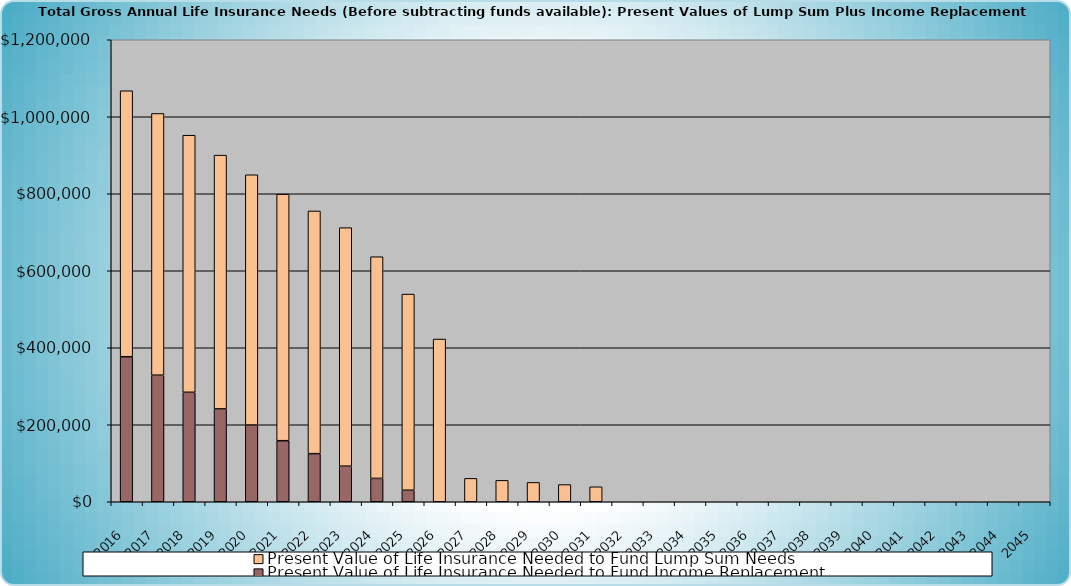
| Category | Present Value of Life Insurance Needed to Fund Income Replacement | Present Value of Life Insurance Needed to Fund Lump Sum Needs |
|---|---|---|
| 2016.0 | 376738.288 | 690818.72 |
| 2017.0 | 328738.288 | 679813.857 |
| 2018.0 | 284330.125 | 667717.162 |
| 2019.0 | 241190.766 | 659117.928 |
| 2020.0 | 199283.961 | 650032.358 |
| 2021.0 | 158574.493 | 640430.92 |
| 2022.0 | 124994.8 | 630282.194 |
| 2023.0 | 92374.527 | 619552.74 |
| 2024.0 | 60686.261 | 575767.872 |
| 2025.0 | 29903.375 | 509495.581 |
| 2026.0 | 0 | 422662.998 |
| 2027.0 | 0 | 60717.977 |
| 2028.0 | 0 | 55565.158 |
| 2029.0 | 0 | 50214.778 |
| 2030.0 | 0 | 44659.363 |
| 2031.0 | 0 | 38891.158 |
| 2032.0 | 0 | 0 |
| 2033.0 | 0 | 0 |
| 2034.0 | 0 | 0 |
| 2035.0 | 0 | 0 |
| 2036.0 | 0 | 0 |
| 2037.0 | 0 | 0 |
| 2038.0 | 0 | 0 |
| 2039.0 | 0 | 0 |
| 2040.0 | 0 | 0 |
| 2041.0 | 0 | 0 |
| 2042.0 | 0 | 0 |
| 2043.0 | 0 | 0 |
| 2044.0 | 0 | 0 |
| 2045.0 | 0 | 0 |